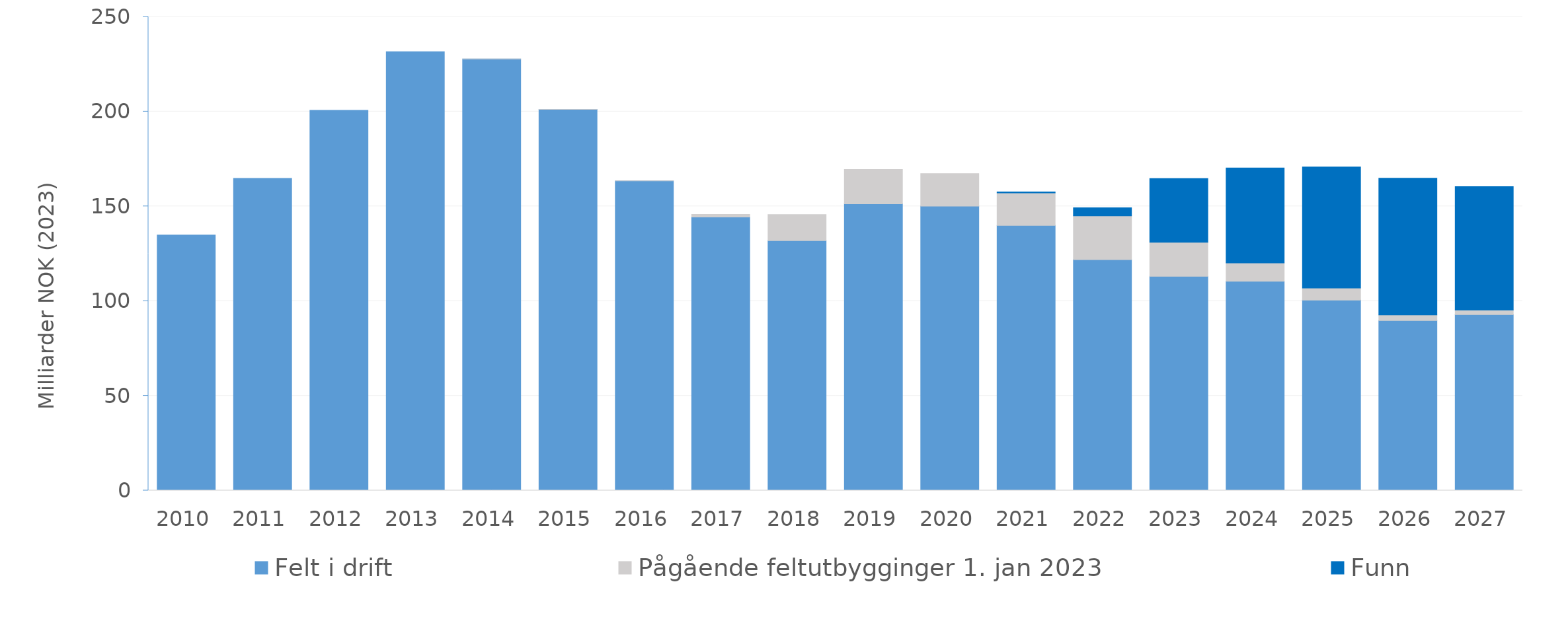
| Category | Felt i drift | Pågående feltutbygginger 1. jan 2023 | Funn |
|---|---|---|---|
| 2010.0 | 134.879 | 0 | 0 |
| 2011.0 | 164.725 | 0 | 0 |
| 2012.0 | 200.64 | 0 | 0 |
| 2013.0 | 231.615 | 0 | 0 |
| 2014.0 | 227.787 | 0.001 | 0 |
| 2015.0 | 201.215 | 0.004 | 0 |
| 2016.0 | 163.475 | 0.006 | 0 |
| 2017.0 | 144.344 | 1.412 | 0 |
| 2018.0 | 131.899 | 13.777 | 0 |
| 2019.0 | 151.326 | 18.105 | 0 |
| 2020.0 | 150.084 | 17.172 | 0 |
| 2021.0 | 139.932 | 17.119 | 0.593 |
| 2022.0 | 121.843 | 23.121 | 4.267 |
| 2023.0 | 113.05 | 17.978 | 33.64 |
| 2024.0 | 110.432 | 9.69 | 50.122 |
| 2025.0 | 100.548 | 6.35 | 63.823 |
| 2026.0 | 89.682 | 2.958 | 72.156 |
| 2027.0 | 92.797 | 2.478 | 65.092 |